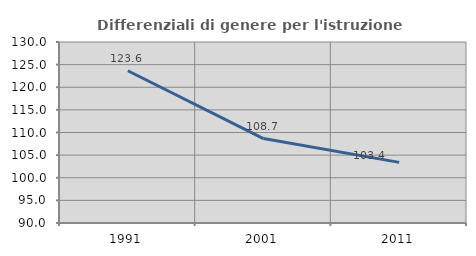
| Category | Differenziali di genere per l'istruzione superiore |
|---|---|
| 1991.0 | 123.645 |
| 2001.0 | 108.654 |
| 2011.0 | 103.395 |